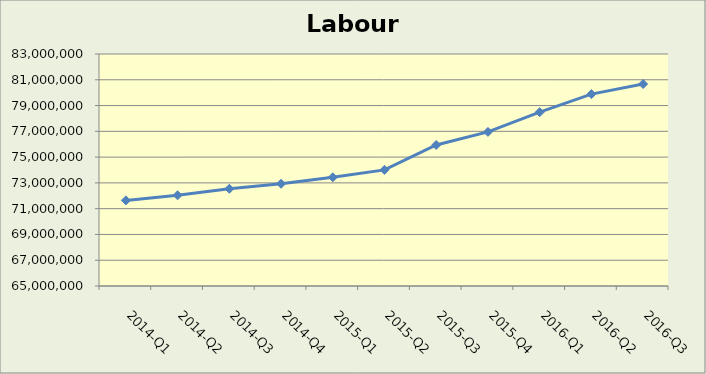
| Category | Labour Force |
|---|---|
| 2014-Q1 | 71641170.877 |
| 2014-Q2 | 72037644.865 |
| 2014-Q3 | 72545834 |
| 2014-Q4 | 72931608.237 |
| 2015-Q1 | 73436104.383 |
| 2015-Q2 | 74010602.141 |
| 2015-Q3 | 75940402 |
| 2015-Q4 | 76957923 |
| 2016-Q1 | 78486570 |
| 2016-Q2 | 79886310 |
| 2016-Q3 | 80669195.838 |